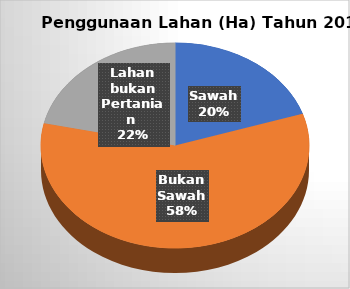
| Category | Series 0 |
|---|---|
| Sawah | 17318.69 |
| Bukan Sawah | 50658 |
| Lahan bukan Pertanian  | 18623 |